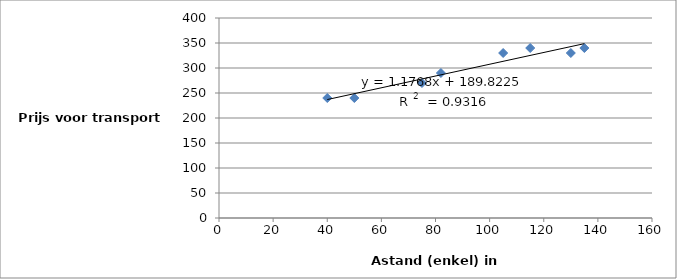
| Category | Series 0 |
|---|---|
| 40.0 | 240 |
| 130.0 | 330 |
| 75.0 | 270 |
| 50.0 | 240 |
| 82.0 | 290 |
| 105.0 | 330 |
| 135.0 | 340 |
| 115.0 | 340 |